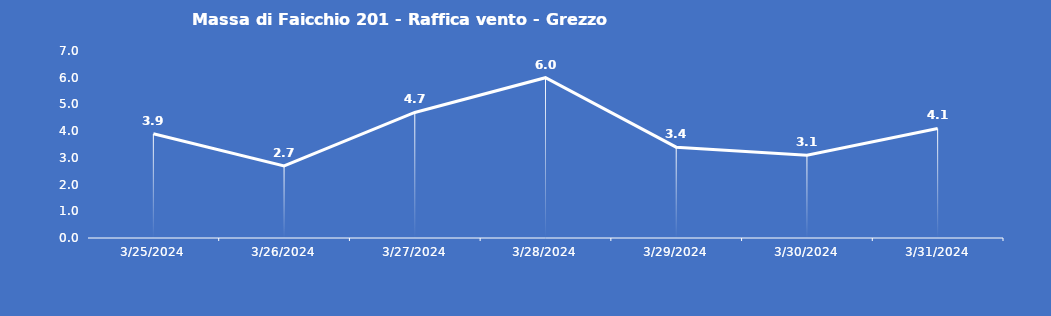
| Category | Massa di Faicchio 201 - Raffica vento - Grezzo (m/s) |
|---|---|
| 3/25/24 | 3.9 |
| 3/26/24 | 2.7 |
| 3/27/24 | 4.7 |
| 3/28/24 | 6 |
| 3/29/24 | 3.4 |
| 3/30/24 | 3.1 |
| 3/31/24 | 4.1 |